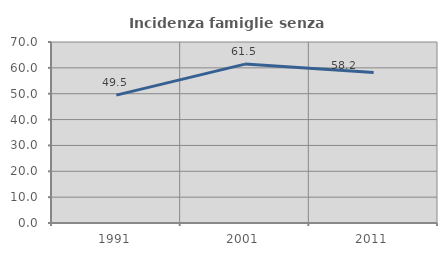
| Category | Incidenza famiglie senza nuclei |
|---|---|
| 1991.0 | 49.468 |
| 2001.0 | 61.453 |
| 2011.0 | 58.182 |